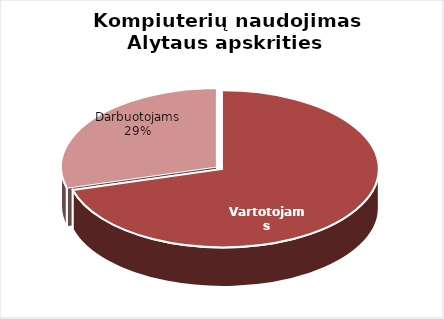
| Category | Series 0 |
|---|---|
| Vartotojams | 477 |
| Darbuotojams | 198 |